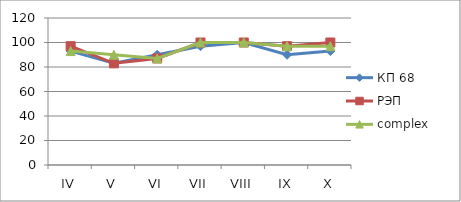
| Category | КП 68 | РЭП  | complex |
|---|---|---|---|
| IV | 93 | 97 | 93 |
| V | 83 | 83 | 90 |
| VI | 90 | 87 | 87 |
| VII | 97 | 100 | 100 |
| VIII | 100 | 100 | 100 |
| IX | 90 | 97 | 97 |
| X | 93 | 100 | 97 |